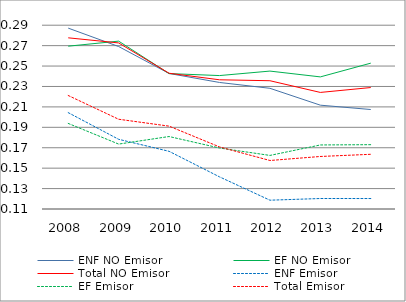
| Category | ENF NO Emisor | EF NO Emisor | Total NO Emisor | ENF Emisor | EF Emisor | Total Emisor |
|---|---|---|---|---|---|---|
| 2008.0 | 0.287 | 0.269 | 0.278 | 0.204 | 0.194 | 0.221 |
| 2009.0 | 0.269 | 0.274 | 0.273 | 0.178 | 0.174 | 0.198 |
| 2010.0 | 0.243 | 0.243 | 0.243 | 0.166 | 0.181 | 0.191 |
| 2011.0 | 0.234 | 0.241 | 0.237 | 0.141 | 0.17 | 0.171 |
| 2012.0 | 0.228 | 0.245 | 0.236 | 0.119 | 0.162 | 0.158 |
| 2013.0 | 0.212 | 0.239 | 0.224 | 0.12 | 0.173 | 0.161 |
| 2014.0 | 0.207 | 0.253 | 0.229 | 0.12 | 0.173 | 0.164 |